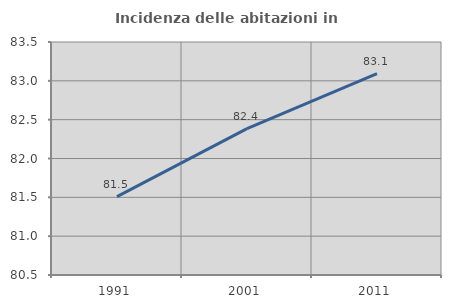
| Category | Incidenza delle abitazioni in proprietà  |
|---|---|
| 1991.0 | 81.51 |
| 2001.0 | 82.385 |
| 2011.0 | 83.094 |